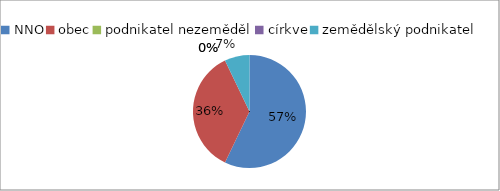
| Category | výzva 2009/1/ |
|---|---|
| NNO | 8 |
| obec | 5 |
| podnikatel nezeměděl | 0 |
| církve | 0 |
| zemědělský podnikatel | 1 |